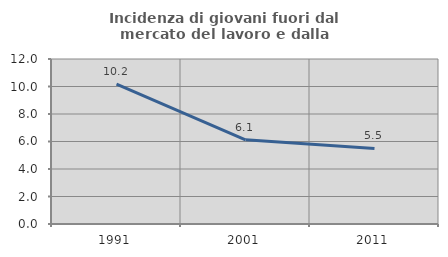
| Category | Incidenza di giovani fuori dal mercato del lavoro e dalla formazione  |
|---|---|
| 1991.0 | 10.165 |
| 2001.0 | 6.122 |
| 2011.0 | 5.497 |